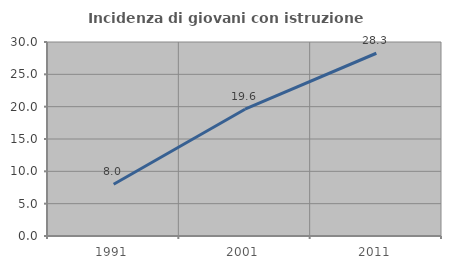
| Category | Incidenza di giovani con istruzione universitaria |
|---|---|
| 1991.0 | 8 |
| 2001.0 | 19.608 |
| 2011.0 | 28.261 |